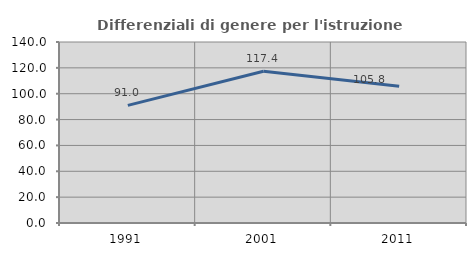
| Category | Differenziali di genere per l'istruzione superiore |
|---|---|
| 1991.0 | 90.975 |
| 2001.0 | 117.38 |
| 2011.0 | 105.816 |